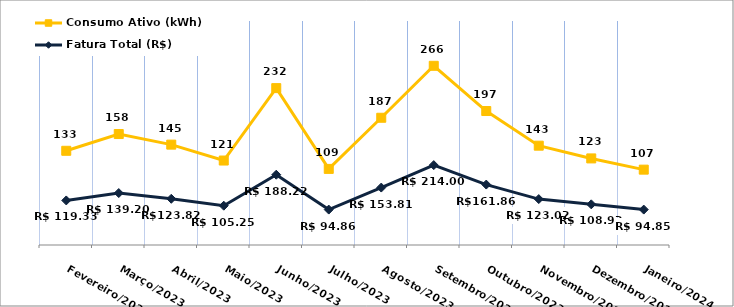
| Category | Fatura Total (R$) | Consumo Ativo (kWh) |
|---|---|---|
| Fevereiro/2023 | 119.33 | 133 |
| Março/2023 | 139.2 | 158 |
| Abril/2023 | 123.82 | 145 |
| Maio/2023 | 105.25 | 121 |
| Junho/2023 | 188.22 | 232 |
| Julho/2023 | 94.86 | 109 |
| Agosto/2023 | 153.81 | 187 |
| Setembro/2023 | 214 | 266 |
| Outubro/2023 | 161.86 | 197 |
| Novembro/2023 | 123.02 | 143 |
| Dezembro/2023 | 108.92 | 123 |
| Janeiro/2024 | 94.85 | 107 |